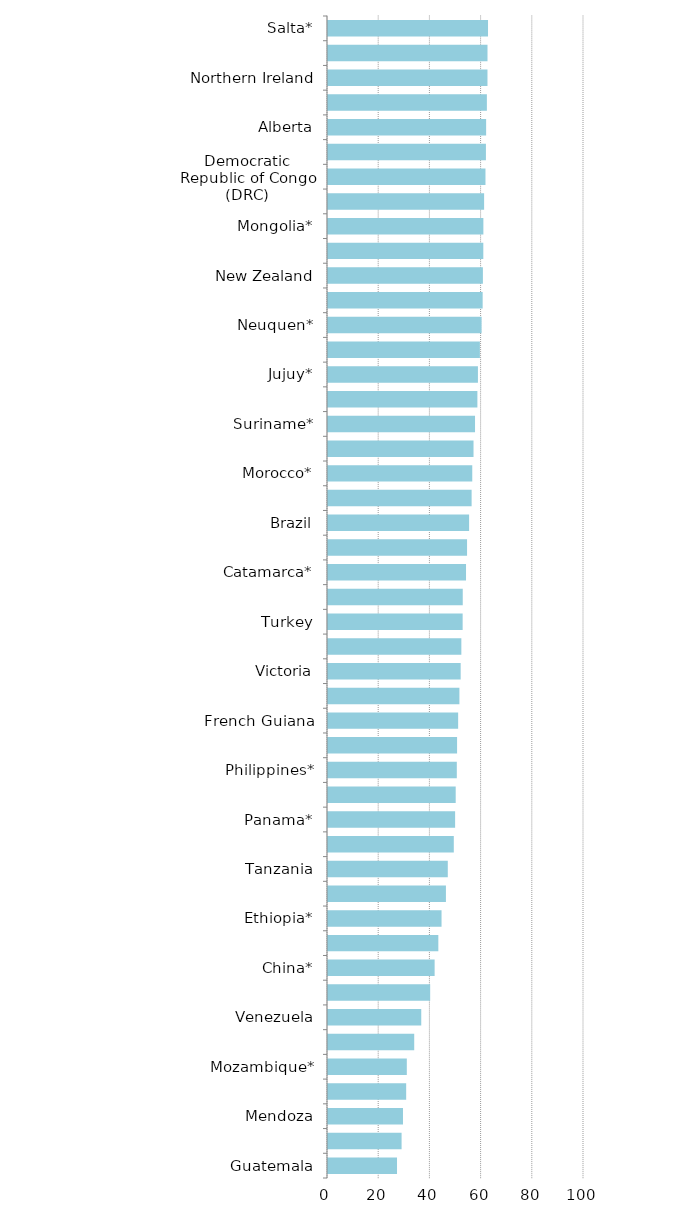
| Category | Series 0 |
|---|---|
| Guatemala | 26.956 |
| Kenya* | 28.744 |
| Mendoza | 29.288 |
| Chubut* | 30.536 |
| Mozambique* | 30.784 |
| Bolivia | 33.68 |
| Venezuela | 36.429 |
| Romania* | 39.912 |
| China* | 41.651 |
| Nicaragua* | 43.096 |
| Ethiopia* | 44.353 |
| La Rioja* | 46.064 |
| Tanzania | 46.794 |
| Ivory Coast* | 49.14 |
| Panama* | 49.656 |
| Washington | 49.884 |
| Philippines* | 50.316 |
| Guyana* | 50.418 |
| French Guiana | 50.837 |
| Dominican Republic* | 51.331 |
| Victoria | 51.822 |
| Ecuador | 52.089 |
| Turkey | 52.596 |
| Burkina Faso | 52.636 |
| Catamarca* | 53.914 |
| Zimbabwe | 54.316 |
| Brazil | 55.121 |
| Colombia | 56.102 |
| Morocco* | 56.352 |
| California | 56.844 |
| Suriname* | 57.434 |
| Wyoming* | 58.353 |
| Jujuy* | 58.567 |
| Zambia | 59.336 |
| Neuquen* | 59.996 |
| Nova Scotia | 60.412 |
| New Zealand | 60.509 |
| Namibia | 60.666 |
| Mongolia* | 60.692 |
| Santa Cruz | 60.981 |
| Democratic Republic of Congo (DRC) | 61.512 |
| Tasmania | 61.689 |
| Alberta | 61.768 |
| South Africa | 62.064 |
| Northern Ireland | 62.295 |
| New South Wales | 62.305 |
| Salta* | 62.506 |